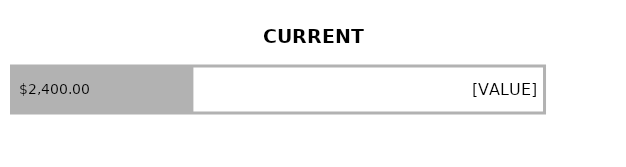
| Category | Total Income | Total Expenses |
|---|---|---|
| 0 | 7020 | 2400 |